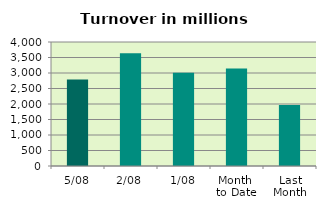
| Category | Series 0 |
|---|---|
| 5/08 | 2794.196 |
| 2/08 | 3636.382 |
| 1/08 | 3010.715 |
| Month 
to Date | 3147.097 |
| Last
Month | 1965.856 |